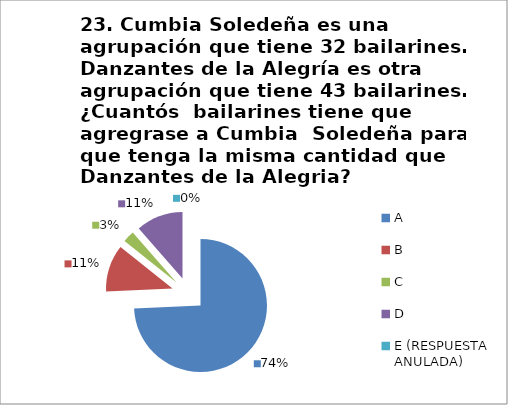
| Category | CANTIDAD DE RESPUESTAS PREGUNTA (23) | PORCENTAJE |
|---|---|---|
| A | 26 | 0.743 |
| B | 4 | 0.114 |
| C | 1 | 0.029 |
| D | 4 | 0.114 |
| E (RESPUESTA ANULADA) | 0 | 0 |